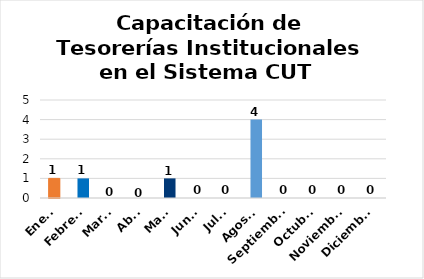
| Category | Capacitación de Tesorerías Institucionales en el Sistema CUT  |
|---|---|
| Enero | 1 |
| Febrero | 1 |
| Marzo | 0 |
| Abril | 0 |
| Mayo | 1 |
| Junio | 0 |
| Julio | 0 |
| Agosto | 4 |
| Septiembre | 0 |
| Octubre | 0 |
| Noviembre | 0 |
| Diciembre | 0 |